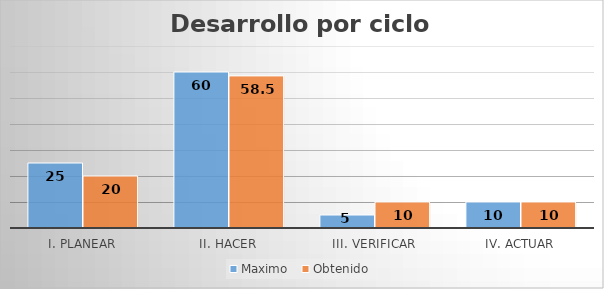
| Category | Maximo  | Obtenido |
|---|---|---|
| I. PLANEAR | 25 | 20 |
| II. HACER | 60 | 58.5 |
| III. VERIFICAR | 5 | 10 |
| IV. ACTUAR | 10 | 10 |